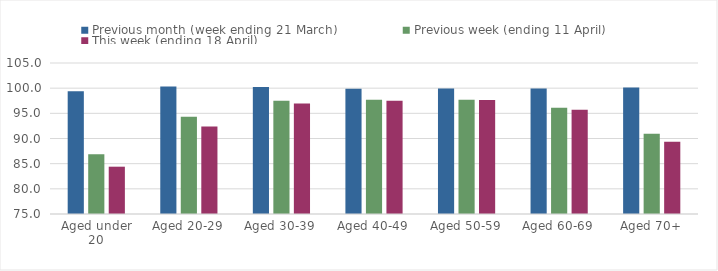
| Category | Previous month (week ending 21 March) | Previous week (ending 11 April) | This week (ending 18 April) |
|---|---|---|---|
| Aged under 20 | 99.386 | 86.875 | 84.4 |
| Aged 20-29 | 100.317 | 94.321 | 92.375 |
| Aged 30-39 | 100.233 | 97.51 | 96.973 |
| Aged 40-49 | 99.905 | 97.7 | 97.504 |
| Aged 50-59 | 99.954 | 97.718 | 97.63 |
| Aged 60-69 | 99.945 | 96.089 | 95.688 |
| Aged 70+ | 100.148 | 90.927 | 89.332 |